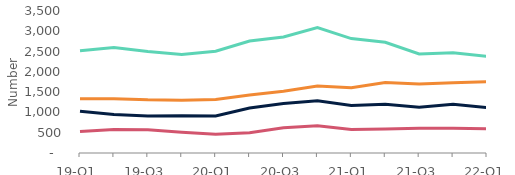
| Category | Arrears of 2.5%-5% of balance | Arrears of 5%-7.5% of balance | Arrears of 7.5%-10% of balance | Arrears over 10% of balance |
|---|---|---|---|---|
| 19-Q1 | 2520 | 1030 | 530 | 1340 |
| 19-Q2 | 2600 | 950 | 580 | 1340 |
| 19-Q3 | 2500 | 910 | 570 | 1310 |
| 19-Q4 | 2430 | 920 | 510 | 1300 |
| 20-Q1 | 2510 | 910 | 460 | 1320 |
| 20-Q2 | 2760 | 1110 | 500 | 1430 |
| 20-Q3 | 2860 | 1220 | 620 | 1520 |
| 20-Q4 | 3090 | 1290 | 670 | 1650 |
| 21-Q1 | 2820 | 1170 | 580 | 1610 |
| 21-Q2 | 2730 | 1200 | 590 | 1740 |
| 21-Q3 | 2440 | 1130 | 610 | 1700 |
| 21-Q4 | 2470 | 1200 | 610 | 1730 |
| 22-Q1 | 2380 | 1120 | 600 | 1760 |